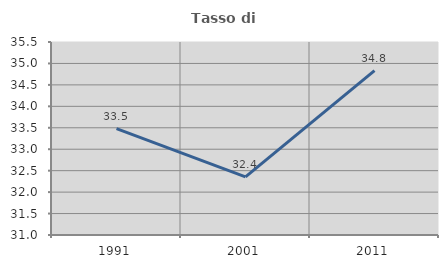
| Category | Tasso di occupazione   |
|---|---|
| 1991.0 | 33.482 |
| 2001.0 | 32.355 |
| 2011.0 | 34.834 |